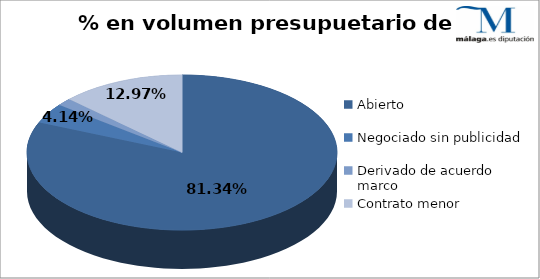
| Category | Series 0 |
|---|---|
| Abierto | 0.813 |
| Negociado sin publicidad | 0.041 |
| Derivado de acuerdo marco | 0.016 |
| Contrato menor | 0.13 |